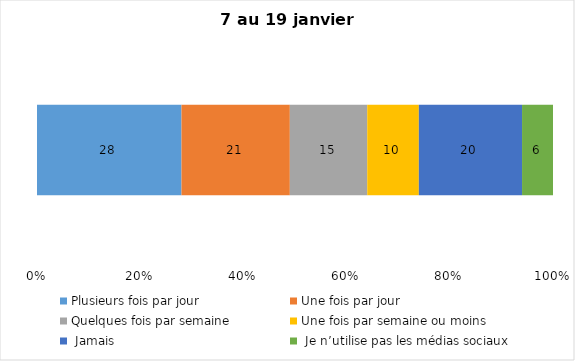
| Category | Plusieurs fois par jour | Une fois par jour | Quelques fois par semaine   | Une fois par semaine ou moins   |  Jamais   |  Je n’utilise pas les médias sociaux |
|---|---|---|---|---|---|---|
| 0 | 28 | 21 | 15 | 10 | 20 | 6 |